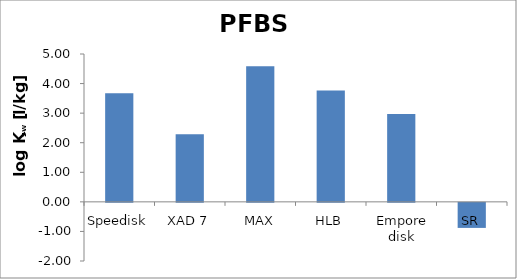
| Category | PFBS  |
|---|---|
| Speedisk | 3.675 |
| XAD 7 | 2.288 |
| MAX | 4.582 |
| HLB | 3.768 |
| Empore disk | 2.971 |
| SR | -0.847 |